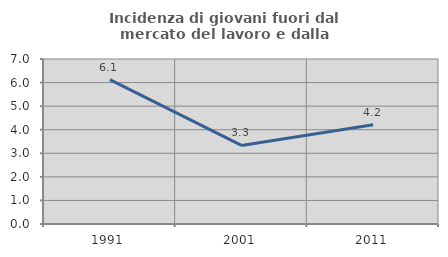
| Category | Incidenza di giovani fuori dal mercato del lavoro e dalla formazione  |
|---|---|
| 1991.0 | 6.122 |
| 2001.0 | 3.333 |
| 2011.0 | 4.211 |